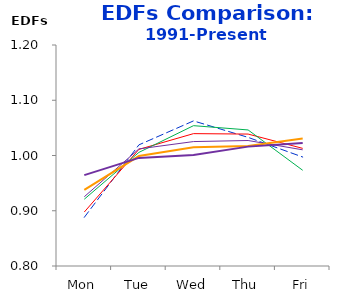
| Category | 1991-95 | 1996-00 | 2001-05 | 2006-10 | 2011-15 | 2016-Pres |
|---|---|---|---|---|---|---|
| Mon | 0.888 | 0.898 | 0.921 | 0.925 | 0.938 | 0.965 |
| Tue | 1.019 | 1.011 | 1.006 | 1.012 | 0.999 | 0.996 |
| Wed | 1.063 | 1.04 | 1.054 | 1.025 | 1.015 | 1.001 |
| Thu | 1.033 | 1.039 | 1.046 | 1.027 | 1.017 | 1.016 |
| Fri | 0.997 | 1.013 | 0.973 | 1.01 | 1.031 | 1.023 |